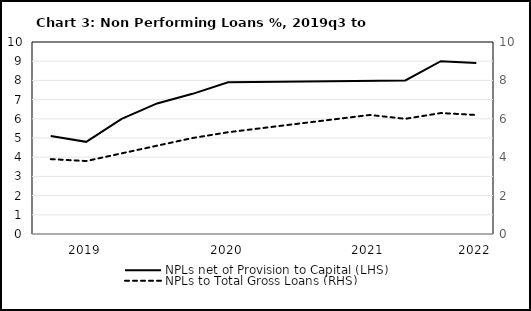
| Category | NPLs net of Provision to Capital (LHS) |
|---|---|
| nan | 5.1 |
| 2019.0 | 4.8 |
| nan | 6 |
| nan | 6.8 |
| nan | 7.3 |
| 2020.0 | 7.9 |
| nan | 0 |
| nan | 0 |
| nan | 0 |
| 2021.0 | 0 |
| nan | 8 |
| nan | 9 |
| 2022.0 | 8.9 |